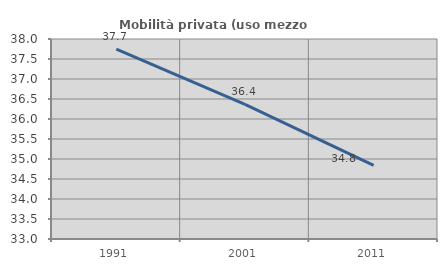
| Category | Mobilità privata (uso mezzo privato) |
|---|---|
| 1991.0 | 37.748 |
| 2001.0 | 36.365 |
| 2011.0 | 34.839 |